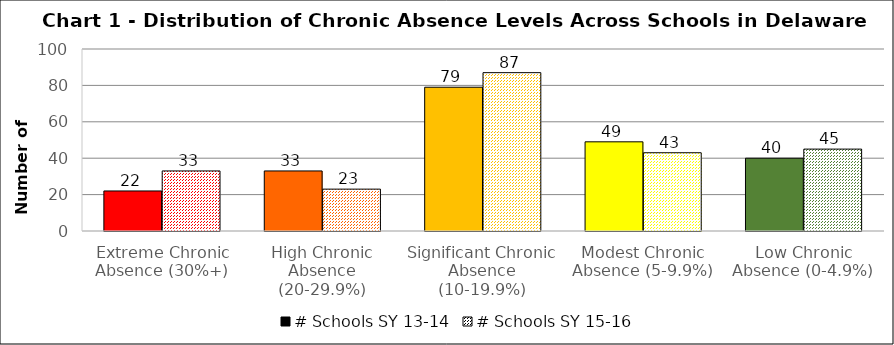
| Category | # Schools SY 13-14 | # Schools SY 15-16 |
|---|---|---|
| Extreme Chronic Absence (30%+) | 22 | 33 |
| High Chronic Absence (20-29.9%) | 33 | 23 |
| Significant Chronic Absence (10-19.9%) | 79 | 87 |
| Modest Chronic Absence (5-9.9%) | 49 | 43 |
| Low Chronic Absence (0-4.9%) | 40 | 45 |